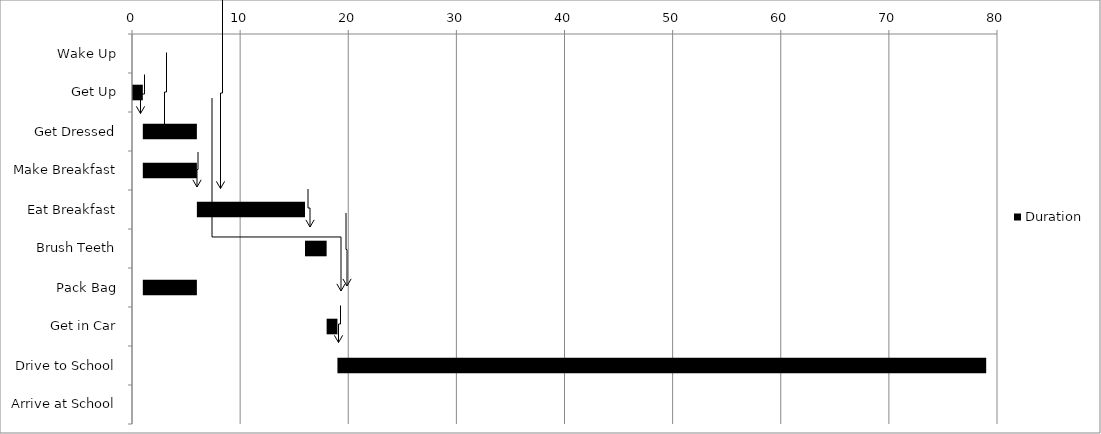
| Category | Start Time | Duration |
|---|---|---|
| Wake Up | 0 | 0 |
| Get Up | 0 | 1 |
| Get Dressed | 1 | 5 |
| Make Breakfast | 1 | 5 |
| Eat Breakfast | 6 | 10 |
| Brush Teeth | 16 | 2 |
| Pack Bag | 1 | 5 |
| Get in Car | 18 | 1 |
| Drive to School | 19 | 60 |
| Arrive at School | 79 | 0 |